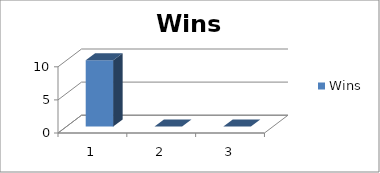
| Category | Wins |
|---|---|
| 0 | 10 |
| 1 | 0 |
| 2 | 0 |